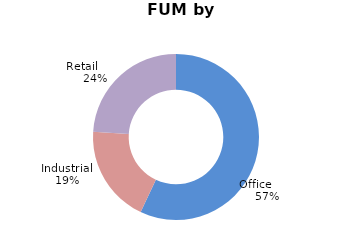
| Category | Series 0 |
|---|---|
| Office        | 0.57 |
| Industrial | 0.19 |
| Retail         | 0.24 |
| International | 0 |